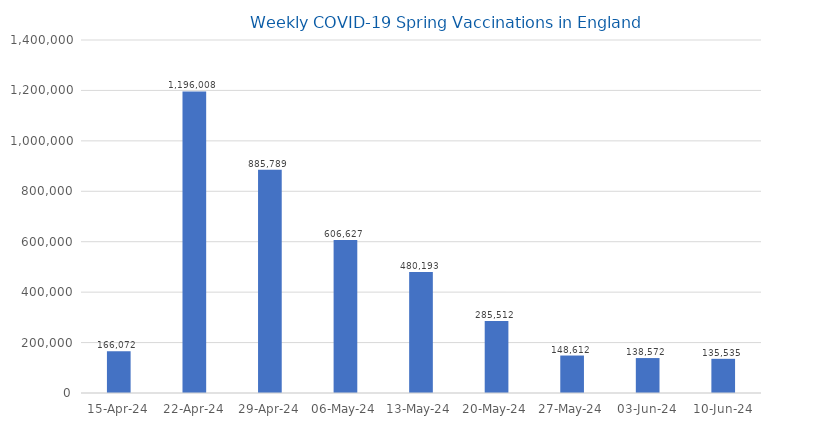
| Category | Series 0 |
|---|---|
| 15-Apr-24 | 166072 |
| 22-Apr-24 | 1196008 |
| 29-Apr-24 | 885789 |
| 06-May-24 | 606627 |
| 13-May-24 | 480193 |
| 20-May-24 | 285512 |
| 27-May-24 | 148612 |
| 03-Jun-24 | 138572 |
| 10-Jun-24 | 135535 |